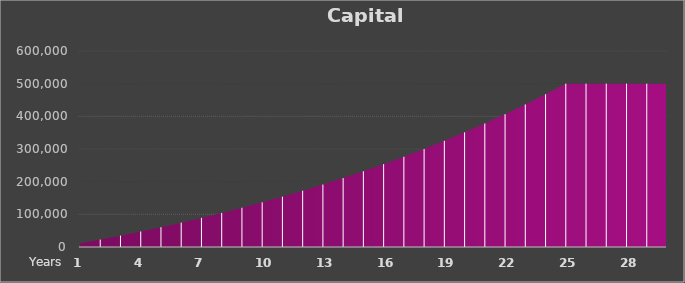
| Category | Capital Repayment |
|---|---|
| 0 | 11076.55 |
| 1 | 22661.954 |
| 2 | 34779.591 |
| 3 | 47453.909 |
| 4 | 60710.483 |
| 5 | 74576.062 |
| 6 | 89078.623 |
| 7 | 104247.429 |
| 8 | 120113.088 |
| 9 | 136707.612 |
| 10 | 154064.485 |
| 11 | 172218.731 |
| 12 | 191206.979 |
| 13 | 211067.544 |
| 14 | 231840.5 |
| 15 | 253567.762 |
| 16 | 276293.17 |
| 17 | 300062.58 |
| 18 | 324923.952 |
| 19 | 350927.452 |
| 20 | 378125.547 |
| 21 | 406573.118 |
| 22 | 436327.566 |
| 23 | 467448.928 |
| 24 | 500000 |
| 25 | 500000 |
| 26 | 500000 |
| 27 | 500000 |
| 28 | 500000 |
| 29 | 500000 |